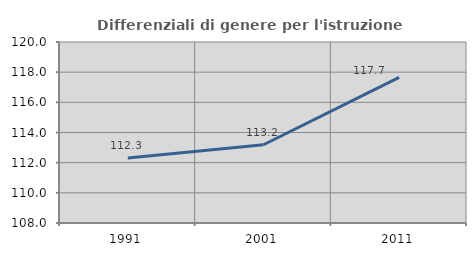
| Category | Differenziali di genere per l'istruzione superiore |
|---|---|
| 1991.0 | 112.313 |
| 2001.0 | 113.188 |
| 2011.0 | 117.654 |